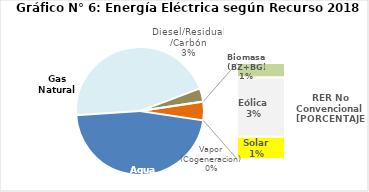
| Category | Series 0 |
|---|---|
| Agua | 2098.785 |
| Gas Natural | 2040.239 |
| Diesel/Residual/Carbón | 152.188 |
| Vapor (Cogeneracion) | 0.27 |
| Biomasa (BZ+BG) | 32.278 |
| Eólica | 130.99 |
| Solar | 49.378 |